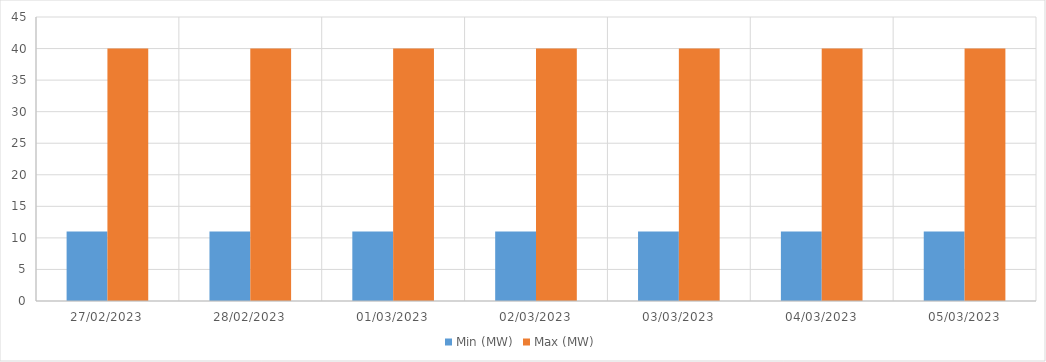
| Category | Min (MW) | Max (MW) |
|---|---|---|
| 27/02/2023 | 11 | 40 |
| 28/02/2023 | 11 | 40 |
| 01/03/2023 | 11 | 40 |
| 02/03/2023 | 11 | 40 |
| 03/03/2023 | 11 | 40 |
| 04/03/2023 | 11 | 40 |
| 05/03/2023 | 11 | 40 |